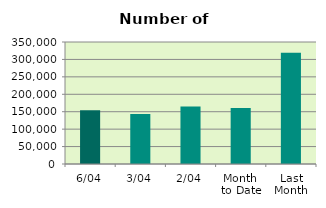
| Category | Series 0 |
|---|---|
| 6/04 | 154096 |
| 3/04 | 143206 |
| 2/04 | 165236 |
| Month 
to Date | 160928.5 |
| Last
Month | 318803.545 |